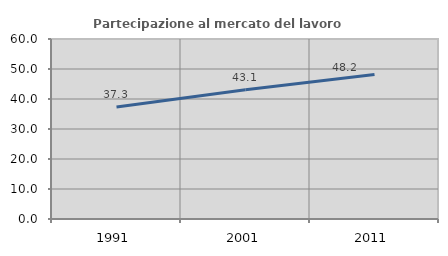
| Category | Partecipazione al mercato del lavoro  femminile |
|---|---|
| 1991.0 | 37.313 |
| 2001.0 | 43.091 |
| 2011.0 | 48.199 |